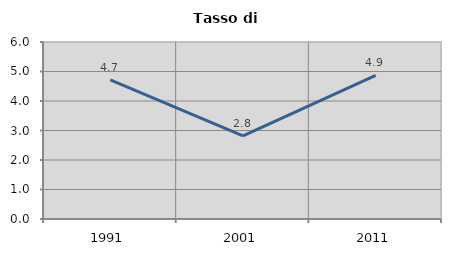
| Category | Tasso di disoccupazione   |
|---|---|
| 1991.0 | 4.714 |
| 2001.0 | 2.82 |
| 2011.0 | 4.871 |